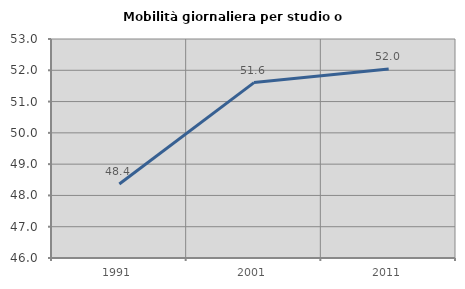
| Category | Mobilità giornaliera per studio o lavoro |
|---|---|
| 1991.0 | 48.364 |
| 2001.0 | 51.607 |
| 2011.0 | 52.038 |